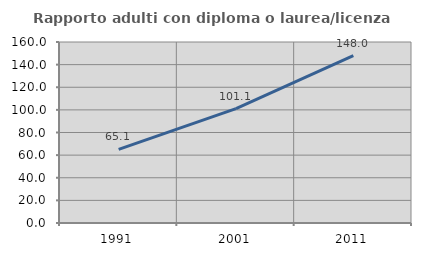
| Category | Rapporto adulti con diploma o laurea/licenza media  |
|---|---|
| 1991.0 | 65.06 |
| 2001.0 | 101.053 |
| 2011.0 | 147.959 |